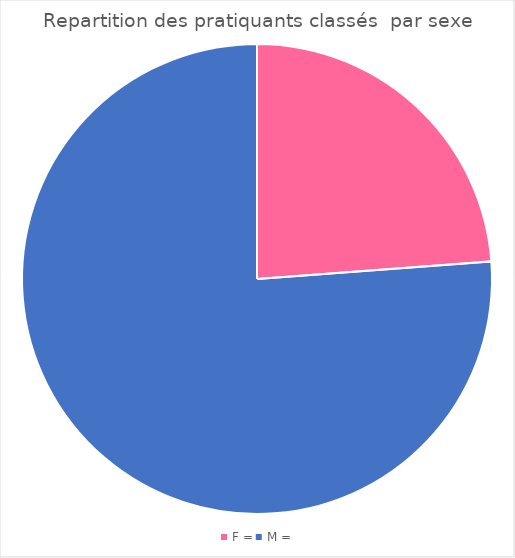
| Category | Series 0 |
|---|---|
| F = | 20 |
| M = | 64 |